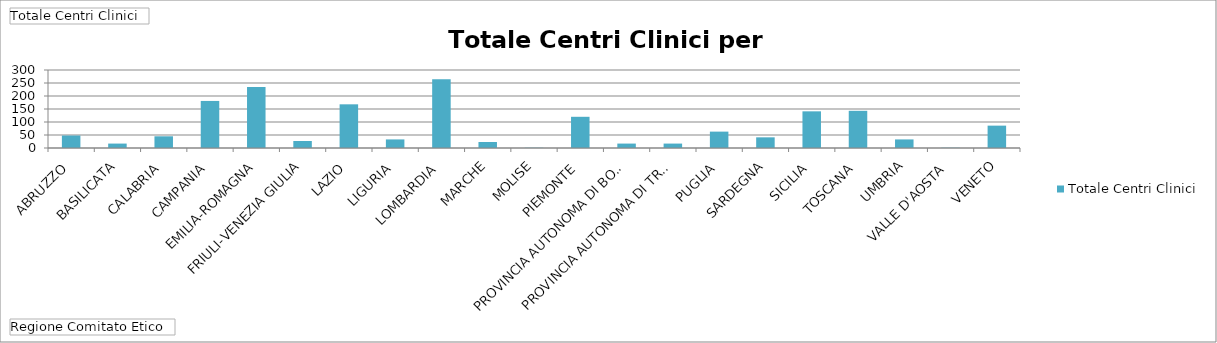
| Category | Totale |
|---|---|
| ABRUZZO | 48 |
| BASILICATA | 17 |
| CALABRIA | 45 |
| CAMPANIA | 181 |
| EMILIA-ROMAGNA | 235 |
| FRIULI-VENEZIA GIULIA | 27 |
| LAZIO | 168 |
| LIGURIA | 33 |
| LOMBARDIA | 264 |
| MARCHE | 23 |
| MOLISE | 1 |
| PIEMONTE | 120 |
| PROVINCIA AUTONOMA DI BOLZANO | 17 |
| PROVINCIA AUTONOMA DI TRENTO | 17 |
| PUGLIA | 63 |
| SARDEGNA | 41 |
| SICILIA | 141 |
| TOSCANA | 143 |
| UMBRIA | 33 |
| VALLE D'AOSTA | 1 |
| VENETO | 86 |